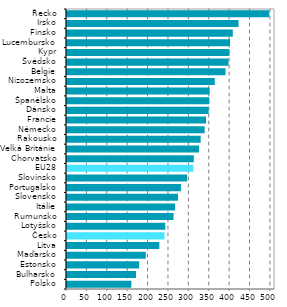
| Category |  2019 |
|---|---|
| Polsko | 160.162 |
| Bulharsko | 171.695 |
| Estonsko | 179.348 |
| Maďarsko | 195.607 |
| Litva | 228.823 |
| Česko | 241.488 |
| Lotyšsko | 243.443 |
| Rumunsko | 263.536 |
| Itálie | 267.383 |
| Slovensko | 274.515 |
| Portugalsko | 281.89 |
| Slovinsko | 297.11 |
| EU28 | 312.294 |
| Chorvatsko | 313.387 |
| Velká Británie | 326.197 |
| Rakousko | 330.22 |
| Německo | 339.861 |
| Francie | 343.35 |
| Dánsko | 349.802 |
| Španělsko | 351.441 |
| Malta | 352.331 |
| Nizozemsko | 364.889 |
| Belgie | 391.118 |
| Švédsko | 398.526 |
| Kypr | 400.617 |
| Lucembursko | 402.253 |
| Finsko | 408.939 |
| Irsko | 423.003 |
| Řecko | 498.454 |